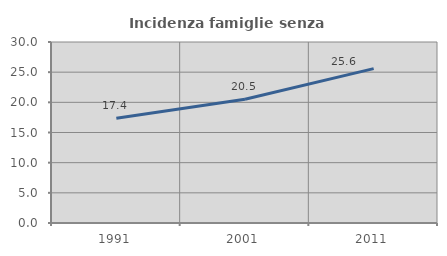
| Category | Incidenza famiglie senza nuclei |
|---|---|
| 1991.0 | 17.36 |
| 2001.0 | 20.504 |
| 2011.0 | 25.59 |